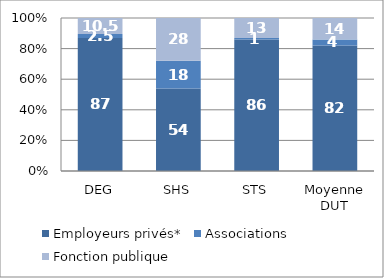
| Category | Employeurs privés* | Associations | Fonction publique |
|---|---|---|---|
| DEG | 87 | 2.5 | 10.5 |
| SHS | 54 | 18 | 28 |
| STS | 86 | 1 | 13 |
| Moyenne DUT | 82 | 4 | 14 |